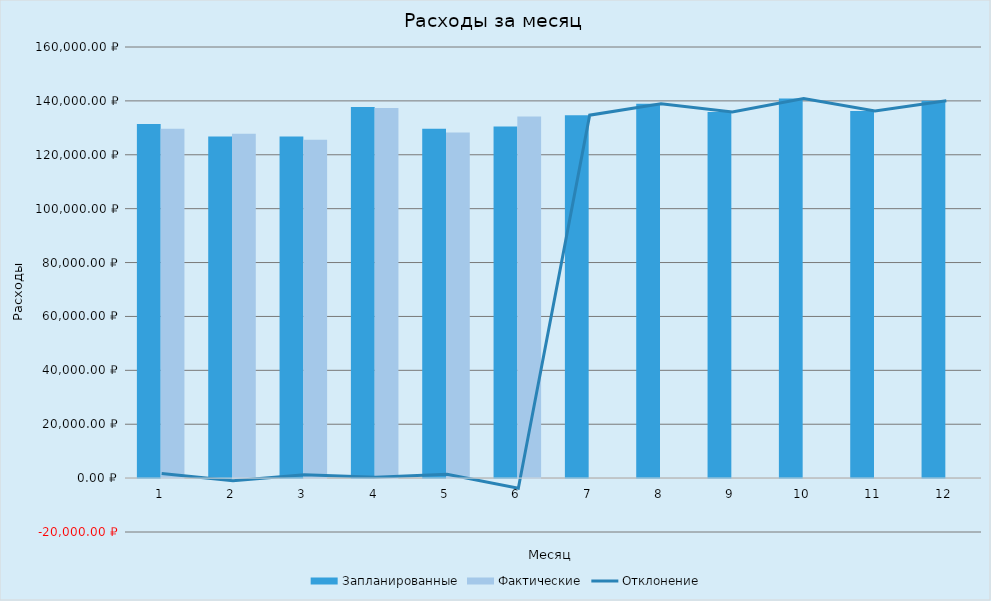
| Category | Запланированные | Фактические |
|---|---|---|
| 0 | 131420 | 129682 |
| 1 | 126820 | 127804 |
| 2 | 126820 | 125565 |
| 3 | 137695 | 137394 |
| 4 | 129695 | 128255 |
| 5 | 130495 | 134239 |
| 6 | 134695 | 0 |
| 7 | 138918 | 0 |
| 8 | 135918 | 0 |
| 9 | 140918 | 0 |
| 10 | 136218 | 0 |
| 11 | 140018 | 0 |